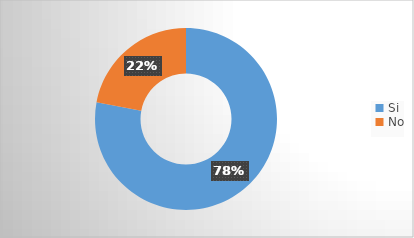
| Category | Series 0 |
|---|---|
| Si | 0.779 |
| No | 0.221 |